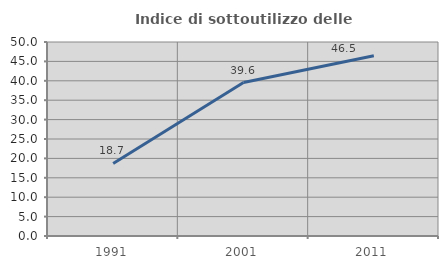
| Category | Indice di sottoutilizzo delle abitazioni  |
|---|---|
| 1991.0 | 18.705 |
| 2001.0 | 39.552 |
| 2011.0 | 46.468 |